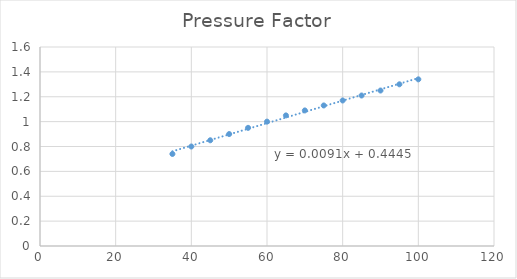
| Category | Pressure Factor |
|---|---|
| 35.0 | 0.74 |
| 40.0 | 0.8 |
| 45.0 | 0.85 |
| 50.0 | 0.9 |
| 55.0 | 0.95 |
| 60.0 | 1 |
| 65.0 | 1.05 |
| 70.0 | 1.09 |
| 75.0 | 1.13 |
| 80.0 | 1.17 |
| 85.0 | 1.21 |
| 90.0 | 1.25 |
| 95.0 | 1.3 |
| 100.0 | 1.34 |